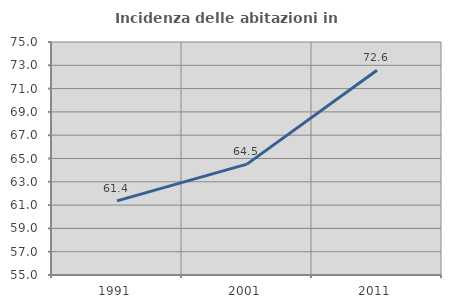
| Category | Incidenza delle abitazioni in proprietà  |
|---|---|
| 1991.0 | 61.364 |
| 2001.0 | 64.516 |
| 2011.0 | 72.578 |